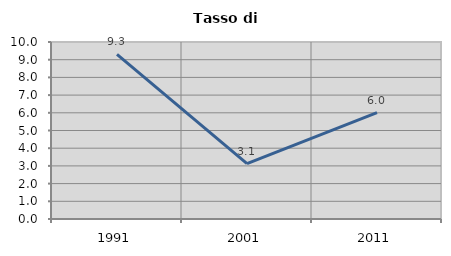
| Category | Tasso di disoccupazione   |
|---|---|
| 1991.0 | 9.298 |
| 2001.0 | 3.133 |
| 2011.0 | 6.014 |